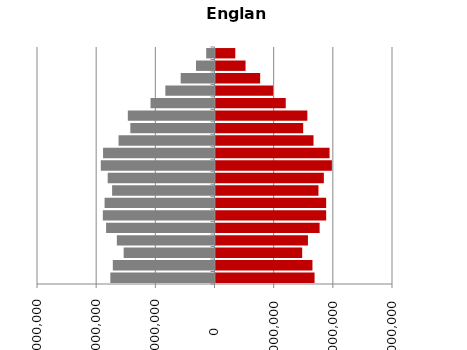
| Category | Female | Male |
|---|---|---|
| 0-4 | 1674292 | -1760388 |
| 5-9 | 1638558 | -1718905 |
| 10-14 | 1465058 | -1535237 |
| 15-19 | 1562775 | -1650514 |
| 20-24 | 1759789 | -1832468 |
| 25-29 | 1870588 | -1887380 |
| 30-34 | 1870145 | -1857883 |
| 35-39 | 1740276 | -1730642 |
| 40-44 | 1831314 | -1805140 |
| 45-49 | 1967553 | -1921807 |
| 50-54 | 1927622 | -1883378 |
| 55-59 | 1656661 | -1621661 |
| 60-64 | 1482039 | -1422682 |
| 65-69 | 1552351 | -1464784 |
| 70-74 | 1187382 | -1081238 |
| 75-79 | 973338 | -830890 |
| 80-84 | 754719 | -571581 |
| 85-89 | 507958 | -312363 |
| 90+ | 334623 | -140345 |